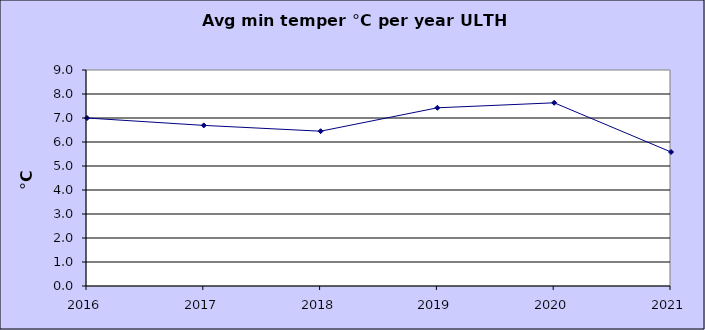
| Category | Series 0 |
|---|---|
| 2016.0 | 7 |
| 2017.0 | 6.692 |
| 2018.0 | 6.45 |
| 2019.0 | 7.425 |
| 2020.0 | 7.633 |
| 2021.0 | 5.583 |